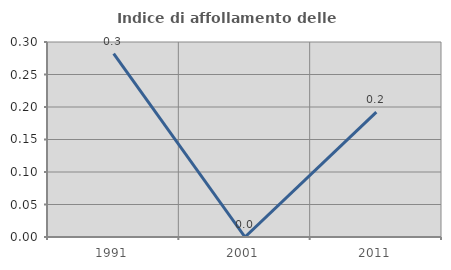
| Category | Indice di affollamento delle abitazioni  |
|---|---|
| 1991.0 | 0.282 |
| 2001.0 | 0 |
| 2011.0 | 0.192 |